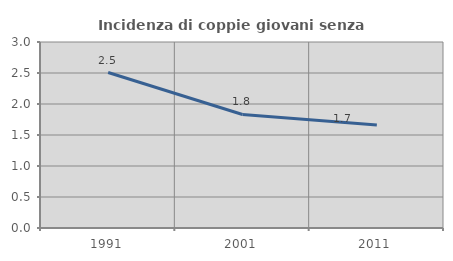
| Category | Incidenza di coppie giovani senza figli |
|---|---|
| 1991.0 | 2.508 |
| 2001.0 | 1.832 |
| 2011.0 | 1.66 |